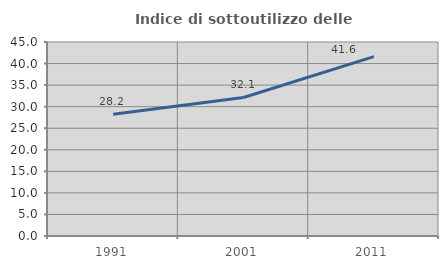
| Category | Indice di sottoutilizzo delle abitazioni  |
|---|---|
| 1991.0 | 28.247 |
| 2001.0 | 32.129 |
| 2011.0 | 41.617 |